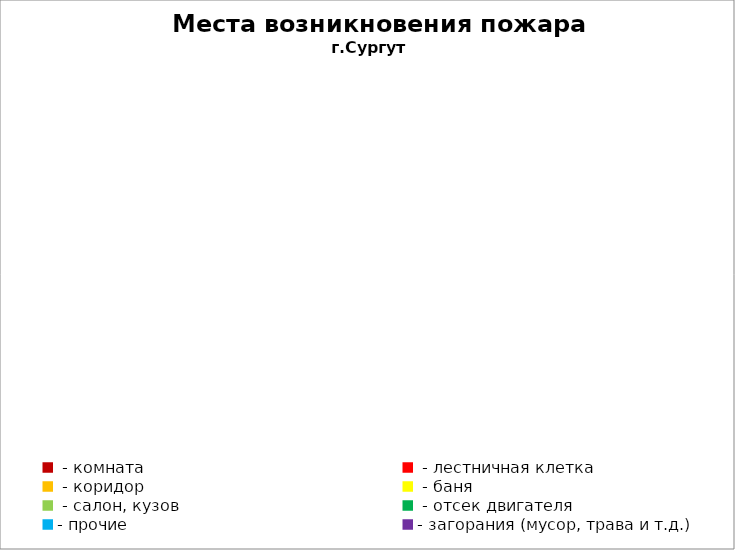
| Category | Места возникновения пожара |
|---|---|
|  - комната | 48 |
|  - лестничная клетка | 18 |
|  - коридор | 9 |
|  - баня | 20 |
|  - салон, кузов | 9 |
|  - отсек двигателя | 23 |
| - прочие | 98 |
| - загорания (мусор, трава и т.д.)  | 152 |